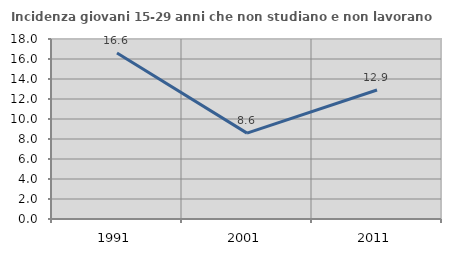
| Category | Incidenza giovani 15-29 anni che non studiano e non lavorano  |
|---|---|
| 1991.0 | 16.608 |
| 2001.0 | 8.586 |
| 2011.0 | 12.901 |